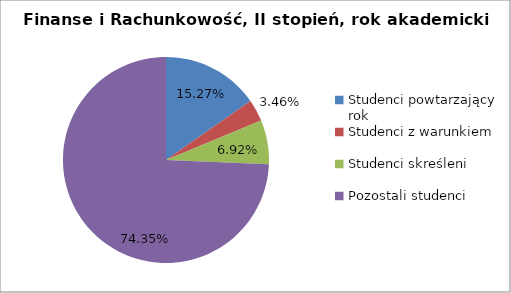
| Category | Series 0 |
|---|---|
| Studenci powtarzający rok | 53 |
| Studenci z warunkiem | 12 |
| Studenci skreśleni | 24 |
| Pozostali studenci | 258 |